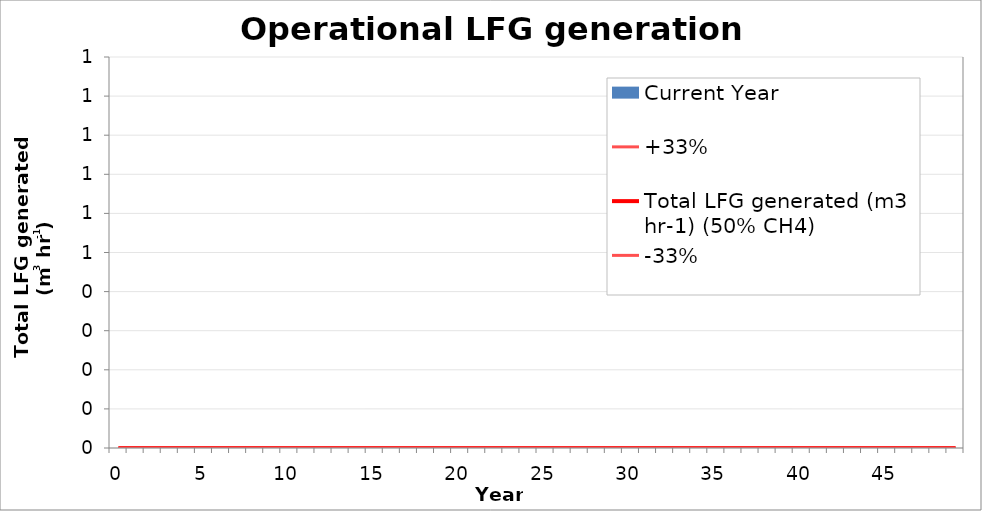
| Category | Current Year |
|---|---|
| 0.0 | 0 |
| 1.0 | 0 |
| 2.0 | 0 |
| 3.0 | 0 |
| 4.0 | 0 |
| 5.0 | 0 |
| 6.0 | 0 |
| 7.0 | 0 |
| 8.0 | 0 |
| 9.0 | 0 |
| 10.0 | 0 |
| 11.0 | 0 |
| 12.0 | 0 |
| 13.0 | 0 |
| 14.0 | 0 |
| 15.0 | 0 |
| 16.0 | 0 |
| 17.0 | 0 |
| 18.0 | 0 |
| 19.0 | 0 |
| 20.0 | 0 |
| 21.0 | 0 |
| 22.0 | 0 |
| 23.0 | 0 |
| 24.0 | 0 |
| 25.0 | 0 |
| 26.0 | 0 |
| 27.0 | 0 |
| 28.0 | 0 |
| 29.0 | 0 |
| 30.0 | 0 |
| 31.0 | 0 |
| 32.0 | 0 |
| 33.0 | 0 |
| 34.0 | 0 |
| 35.0 | 0 |
| 36.0 | 0 |
| 37.0 | 0 |
| 38.0 | 0 |
| 39.0 | 0 |
| 40.0 | 0 |
| 41.0 | 0 |
| 42.0 | 0 |
| 43.0 | 0 |
| 44.0 | 0 |
| 45.0 | 0 |
| 46.0 | 0 |
| 47.0 | 0 |
| 48.0 | 0 |
| 49.0 | 0 |